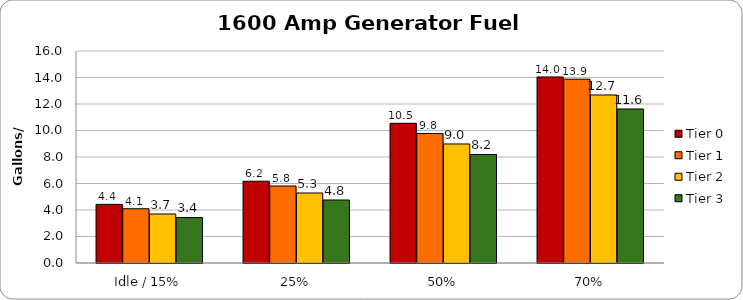
| Category | Tier 0 | Tier 1 | Tier 2 | Tier 3 |
|---|---|---|---|---|
| Idle / 15% | 4.423 | 4.095 | 3.699 | 3.435 |
| 25% | 6.172 | 5.812 | 5.284 | 4.756 |
| 50% | 10.542 | 9.775 | 8.983 | 8.19 |
| 70% | 14.04 | 13.871 | 12.682 | 11.625 |